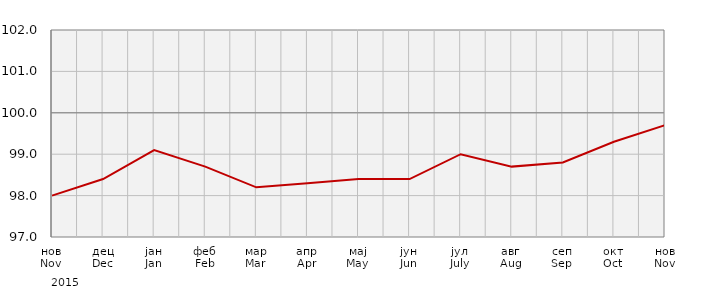
| Category | Индекси потрошачких цијена
Consumer price indices |
|---|---|
| нов
Nov | 98 |
| дец
Dec | 98.4 |
| јан
Jan | 99.1 |
| феб
Feb | 98.7 |
| мар
Mar | 98.2 |
| апр
Apr | 98.3 |
| мај
May | 98.4 |
| јун
Jun | 98.4 |
| јул
July | 99 |
| авг
Aug | 98.7 |
| сеп
Sep | 98.8 |
| окт
Oct | 99.3 |
| нов
Nov | 99.7 |